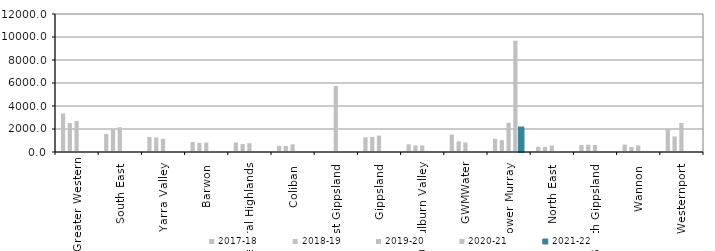
| Category | 2017-18 | 2018-19 | 2019-20 | 2020-21 | 2021-22 |
|---|---|---|---|---|---|
| Greater Western | 3356.263 | 2513.92 | 2705.523 | 0 | 0 |
| South East  | 1572 | 1919.36 | 2151.879 | 0 | 0 |
| Yarra Valley  | 1308.51 | 1263.83 | 1143.19 | 0 | 0 |
| Barwon  | 867 | 794 | 811.2 | 0 | 0 |
| Central Highlands  | 832 | 695 | 766 | 0 | 0 |
| Coliban  | 526.94 | 520.66 | 667 | 0 | 0 |
| East Gippsland  | 0 | 0 | 5740.42 | 0 | 0 |
| Gippsland  | 1281 | 1302 | 1426 | 0 | 0 |
| Goulburn Valley  | 667.26 | 573 | 570.41 | 0 | 0 |
| GWMWater | 1512.586 | 928.104 | 831.116 | 0 | 0 |
| Lower Murray  | 1142.58 | 1024.98 | 2534 | 9678.72 | 2041.96 |
| North East  | 448 | 443.43 | 558.86 | 0 | 0 |
| South Gippsland  | 610 | 634.5 | 609 | 0 | 0 |
| Wannon  | 643 | 431 | 566 | 0 | 0 |
| Westernport  | 1993 | 1348 | 2523 | 0 | 0 |